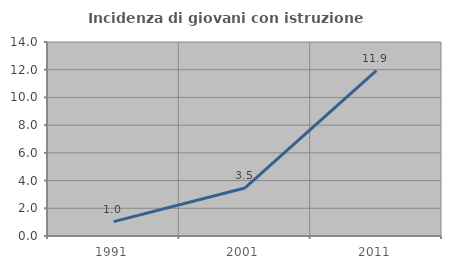
| Category | Incidenza di giovani con istruzione universitaria |
|---|---|
| 1991.0 | 1.036 |
| 2001.0 | 3.465 |
| 2011.0 | 11.94 |